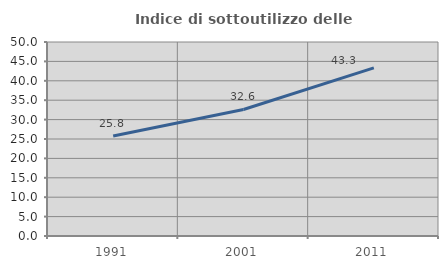
| Category | Indice di sottoutilizzo delle abitazioni  |
|---|---|
| 1991.0 | 25.783 |
| 2001.0 | 32.604 |
| 2011.0 | 43.313 |